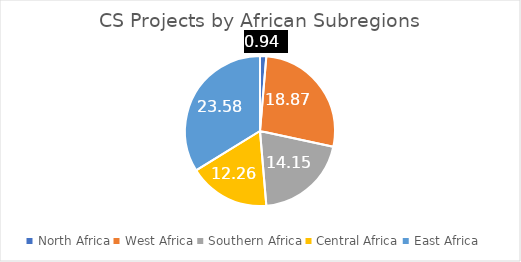
| Category | Series 0 |
|---|---|
| North Africa | 0.943 |
| West Africa | 18.868 |
| Southern Africa | 14.151 |
| Central Africa | 12.264 |
| East Africa | 23.585 |